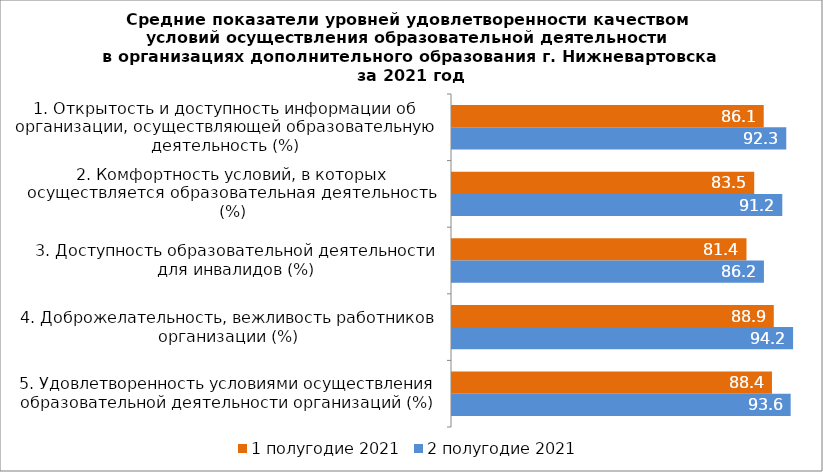
| Category | 1 полугодие 2021 | 2 полугодие 2021 |
|---|---|---|
| 1. Открытость и доступность информации об организации, осуществляющей образовательную деятельность (%) | 86.11 | 92.34 |
| 2. Комфортность условий, в которых осуществляется образовательная деятельность (%) | 83.485 | 91.24 |
| 3. Доступность образовательной деятельности для инвалидов (%) | 81.35 | 86.17 |
| 4. Доброжелательность, вежливость работников организации (%) | 88.89 | 94.22 |
| 5. Удовлетворенность условиями осуществления образовательной деятельности организаций (%) | 88.39 | 93.55 |